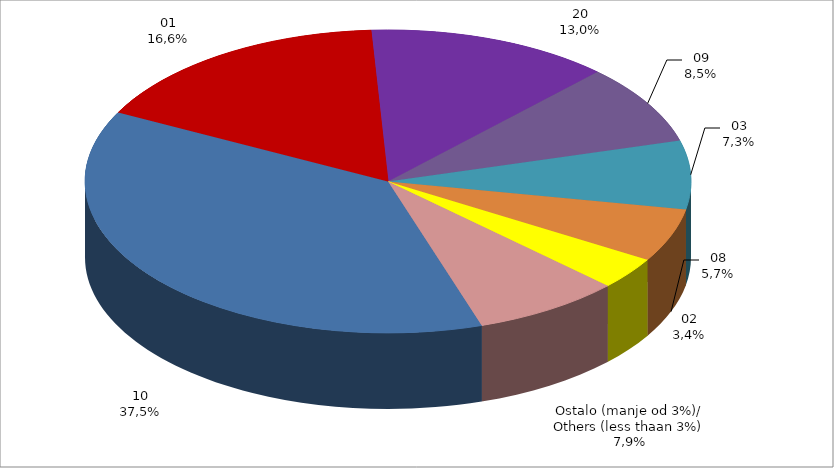
| Category | Series 0 |
|---|---|
| 10 | 2080278.86 |
| 1 | 919122.72 |
| 20 | 722205.72 |
| 9 | 471590.24 |
| 3 | 405868.46 |
| 8 | 315910.74 |
| 2 | 191200.59 |
| Ostalo (manje od 3%)/
Others (less than 3%) | 437837.78 |